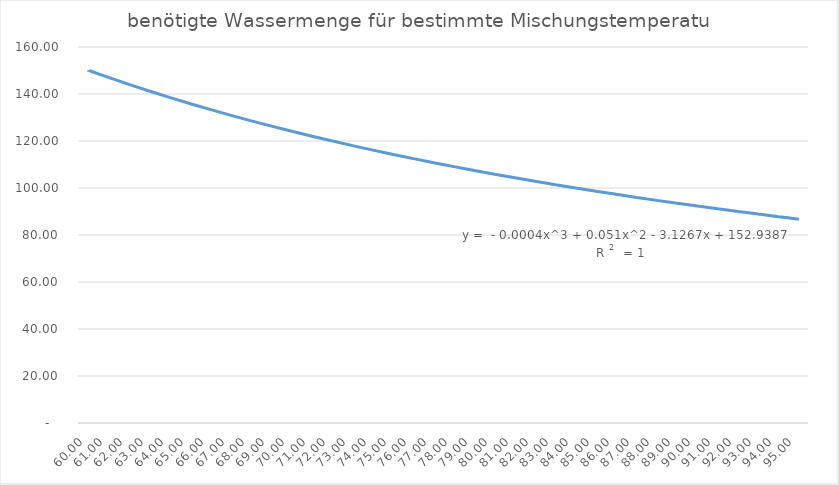
| Category | Series 0 |
|---|---|
| 60.0 | 150 |
| 61.0 | 146.939 |
| 62.0 | 144 |
| 63.0 | 141.176 |
| 64.0 | 138.462 |
| 65.0 | 135.849 |
| 66.0 | 133.333 |
| 67.0 | 130.909 |
| 68.0 | 128.571 |
| 69.0 | 126.316 |
| 70.0 | 124.138 |
| 71.0 | 122.034 |
| 72.0 | 120 |
| 73.0 | 118.033 |
| 74.0 | 116.129 |
| 75.0 | 114.286 |
| 76.0 | 112.5 |
| 77.0 | 110.769 |
| 78.0 | 109.091 |
| 79.0 | 107.463 |
| 80.0 | 105.882 |
| 81.0 | 104.348 |
| 82.0 | 102.857 |
| 83.0 | 101.408 |
| 84.0 | 100 |
| 85.0 | 98.63 |
| 86.0 | 97.297 |
| 87.0 | 96 |
| 88.0 | 94.737 |
| 89.0 | 93.506 |
| 90.0 | 92.308 |
| 91.0 | 91.139 |
| 92.0 | 90 |
| 93.0 | 88.889 |
| 94.0 | 87.805 |
| 95.0 | 86.747 |